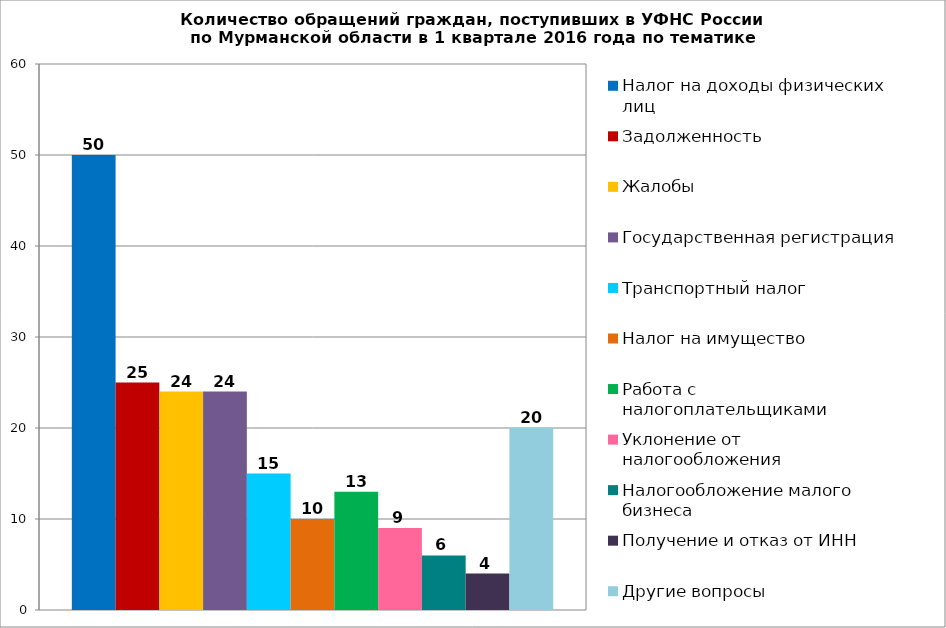
| Category | Налог на доходы физических лиц | Задолженность | Жалобы | Государственная регистрация | Транспортный налог | Налог на имущество | Работа с налогоплательщиками | Уклонение от налогообложения | Налогообложение малого бизнеса | Получение и отказ от ИНН | Другие вопросы |
|---|---|---|---|---|---|---|---|---|---|---|---|
| 0 | 50 | 25 | 24 | 24 | 15 | 10 | 13 | 9 | 6 | 4 | 20 |